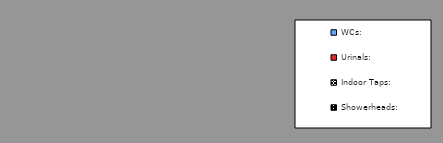
| Category | Series 0 |
|---|---|
| WCs: | 0 |
| Urinals: | 0 |
| Indoor Taps: | 0 |
| Showerheads: | 0 |